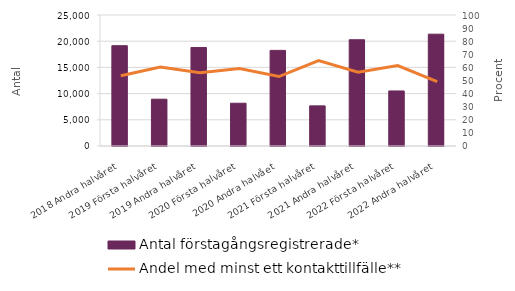
| Category | Antal förstagångsregistrerade* |
|---|---|
| 2018 Andra halvåret | 19139 |
| 2019 Första halvåret | 8932 |
| 2019 Andra halvåret | 18803 |
| 2020 Första halvåret | 8161 |
| 2020 Andra halvået | 18248 |
| 2021 Första halvåret | 7660 |
| 2021 Andra halvåret | 20279 |
| 2022 Första halvåret | 10508 |
| 2022 Andra halvåret | 21342 |